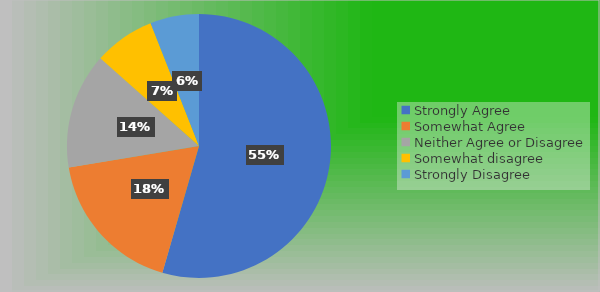
| Category | Series 0 |
|---|---|
| Strongly Agree | 73 |
| Somewhat Agree | 24 |
| Neither Agree or Disagree | 19 |
| Somewhat disagree | 10 |
| Strongly Disagree | 8 |